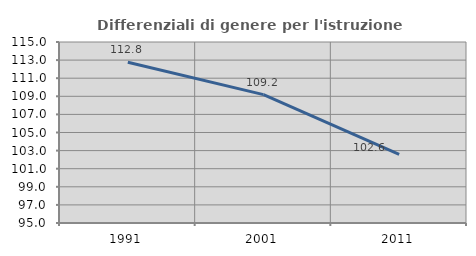
| Category | Differenziali di genere per l'istruzione superiore |
|---|---|
| 1991.0 | 112.77 |
| 2001.0 | 109.186 |
| 2011.0 | 102.578 |